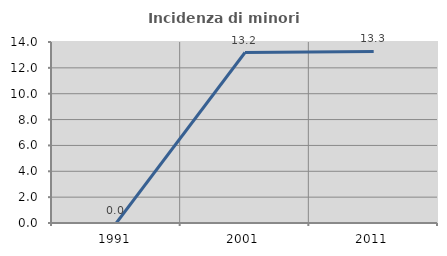
| Category | Incidenza di minori stranieri |
|---|---|
| 1991.0 | 0 |
| 2001.0 | 13.187 |
| 2011.0 | 13.274 |